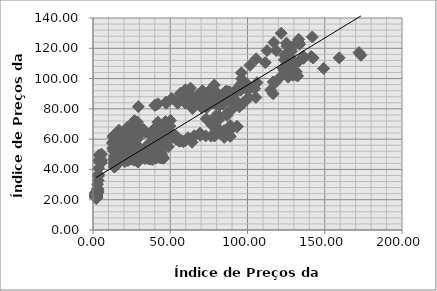
| Category | Series 0 |
|---|---|
| 2.13444915445322 | 22.032 |
| 2.13444915445322 | 21.808 |
| 2.13444915445322 | 21.896 |
| 2.13444915445322 | 22.04 |
| 2.13444915445322 | 22.049 |
| 2.13444915445322 | 21.743 |
| 2.13444915445322 | 21.682 |
| 2.13444915445322 | 21.726 |
| 2.13444915445322 | 21.878 |
| 2.13444915445322 | 21.218 |
| 2.13444915445322 | 20.765 |
| 2.13444915445322 | 21.111 |
| 2.08333169406974 | 21.223 |
| 2.08333169406974 | 21.654 |
| 2.08333169406974 | 22.199 |
| 2.08333169406974 | 22.438 |
| 2.08333169406974 | 22.354 |
| 2.08333169406974 | 21.982 |
| 2.08333169406974 | 21.842 |
| 2.08333169406974 | 21.619 |
| 2.08333169406974 | 21.386 |
| 2.08333169406974 | 21.354 |
| 2.08333169406974 | 21.582 |
| 2.08333169406974 | 21.59 |
| 2.04291400240146 | 21.317 |
| 2.04291400240146 | 21.414 |
| 2.04291400240146 | 21.411 |
| 2.04291400240146 | 21.447 |
| 2.04291400240146 | 21.657 |
| 2.04291400240146 | 21.552 |
| 2.04291400240146 | 21.477 |
| 2.04291400240146 | 21.346 |
| 2.04291400240146 | 21.489 |
| 2.04291400240146 | 21.241 |
| 2.04291400240146 | 21.728 |
| 2.04291400240146 | 21.696 |
| 2.01464105072438 | 22.077 |
| 2.01464105072438 | 22.329 |
| 2.01464105072438 | 22.384 |
| 2.01464105072438 | 22.726 |
| 2.01464105072438 | 23.479 |
| 2.01464105072438 | 23.402 |
| 2.01464105072438 | 23.203 |
| 2.01464105072438 | 22.584 |
| 2.01464105072438 | 22.697 |
| 2.01464105072438 | 23.724 |
| 2.01464105072438 | 23.737 |
| 2.01464105072438 | 23.585 |
| 1.94437457589987 | 23.984 |
| 1.94437457589987 | 23.485 |
| 1.94437457589987 | 23.28 |
| 1.94437457589987 | 23.356 |
| 1.94437457589987 | 23.185 |
| 1.94437457589987 | 22.778 |
| 1.94437457589987 | 22.65 |
| 1.94437457589987 | 22.456 |
| 1.94437457589987 | 22.637 |
| 1.94437457589987 | 22.729 |
| 1.94437457589987 | 22.687 |
| 1.94437457589987 | 22.77 |
| 1.93898601535253 | 22.439 |
| 1.93898601535253 | 22.927 |
| 1.93898601535253 | 22.739 |
| 1.93898601535253 | 22.802 |
| 1.93898601535253 | 22.587 |
| 1.93898601535253 | 22.499 |
| 1.93898601535253 | 22.385 |
| 1.93898601535253 | 22.025 |
| 1.93898601535253 | 22.272 |
| 1.93898601535253 | 22.294 |
| 1.93898601535253 | 22.288 |
| 1.93898601535253 | 22.455 |
| 1.88204058774968 | 23.1 |
| 1.88204058774968 | 23.022 |
| 1.88204058774968 | 23.096 |
| 1.88204058774968 | 23.299 |
| 1.88204058774968 | 23.221 |
| 1.88204058774968 | 23.403 |
| 1.88204058774968 | 23.864 |
| 1.88204058774968 | 24.165 |
| 1.88204058774968 | 23.508 |
| 1.88204058774968 | 23.168 |
| 1.88204058774968 | 23.048 |
| 1.88204058774968 | 23.137 |
| 1.86618435986511 | 23.052 |
| 1.86618435986511 | 23.047 |
| 1.86618435986511 | 23.138 |
| 1.86618435986511 | 23.212 |
| 1.86618435986511 | 23.298 |
| 1.86618435986511 | 23.636 |
| 1.86618435986511 | 23.407 |
| 1.86618435986511 | 23.119 |
| 1.86618435986511 | 23.338 |
| 1.86618435986511 | 23.377 |
| 1.86618435986511 | 23.385 |
| 1.86618435986511 | 22.95 |
| 1.85300340098579 | 22.778 |
| 1.85300340098579 | 22.99 |
| 1.85300340098579 | 22.984 |
| 1.85300340098579 | 22.711 |
| 1.85300340098579 | 22.727 |
| 1.85300340098579 | 22.211 |
| 1.85300340098579 | 22.089 |
| 1.85300340098579 | 21.636 |
| 1.85300340098579 | 21.879 |
| 1.85300340098579 | 21.889 |
| 1.85300340098579 | 22.22 |
| 1.85300340098579 | 22.478 |
| 1.81259494779253 | 22.493 |
| 1.81259494779253 | 22.552 |
| 1.81259494779253 | 22.976 |
| 1.81259494779253 | 22.959 |
| 1.81259494779253 | 23.167 |
| 1.81259494779253 | 23.429 |
| 1.81259494779253 | 23.234 |
| 1.81259494779253 | 23.181 |
| 1.81259494779253 | 23.064 |
| 1.81259494779253 | 23.549 |
| 1.81259494779253 | 23.6 |
| 1.81259494779253 | 23.814 |
| 2.11311453784639 | 24.26 |
| 2.11311453784639 | 24.303 |
| 2.11311453784639 | 24.362 |
| 2.11311453784639 | 24.549 |
| 2.11311453784639 | 24.791 |
| 2.11311453784639 | 24.849 |
| 2.11311453784639 | 24.768 |
| 2.11311453784639 | 24.547 |
| 2.11311453784639 | 24.459 |
| 2.11311453784639 | 24.842 |
| 2.11311453784639 | 25.051 |
| 2.11311453784639 | 24.968 |
| 2.6558711591823 | 24.883 |
| 2.6558711591823 | 24.642 |
| 2.6558711591823 | 24.601 |
| 2.6558711591823 | 24.59 |
| 2.6558711591823 | 24.523 |
| 2.6558711591823 | 24.468 |
| 2.76286762185703 | 24.831 |
| 2.76286762185703 | 25 |
| 2.76286762185703 | 24.552 |
| 2.76286762185703 | 24.522 |
| 2.76286762185703 | 24.358 |
| 2.76286762185703 | 24.557 |
| 2.87178674063629 | 24.956 |
| 2.87178674063629 | 24.946 |
| 2.87178674063629 | 25.557 |
| 2.87178674063629 | 25.545 |
| 2.87178674063629 | 25.48 |
| 2.87178674063629 | 25.219 |
| 2.97878320331102 | 25.184 |
| 2.97878320331102 | 25.582 |
| 2.97878320331102 | 26.306 |
| 2.97878320331102 | 26.713 |
| 2.97878320331102 | 27.461 |
| 2.97878320331102 | 30.239 |
| 3.39561059763125 | 32.755 |
| 3.39561059763125 | 35.547 |
| 3.39561059763125 | 36.329 |
| 3.68450104685302 | 36.58 |
| 3.68450104685302 | 40.753 |
| 3.68450104685302 | 45.999 |
| 4.05898866621457 | 49.506 |
| 4.05898866621457 | 49.319 |
| 4.05898866621457 | 44.957 |
| 5.55693914366076 | 44.472 |
| 5.55693914366076 | 46.079 |
| 5.55693914366076 | 50.09 |
| 15.9696412226623 | 53.311 |
| 15.9696412226623 | 56.849 |
| 15.9696412226623 | 55.345 |
| 13.4017244858324 | 53.181 |
| 13.4017244858324 | 52.717 |
| 13.4017244858324 | 52.126 |
| 12.7597473424204 | 54.121 |
| 12.7597473424204 | 57.876 |
| 12.7597473424204 | 57.191 |
| 13.0807359141263 | 61.247 |
| 13.0807359141263 | 62.155 |
| 13.0807359141263 | 58.175 |
| 13.8359826225372 | 52.93 |
| 13.8359826225372 | 48.895 |
| 13.8359826225372 | 46.725 |
| 13.8359826225372 | 46.445 |
| 13.8359826225372 | 43.163 |
| 13.8359826225372 | 41.665 |
| 13.8466825137002 | 43.831 |
| 13.8466825137002 | 47.396 |
| 13.8466825137002 | 45.569 |
| 13.8787811667912 | 44.249 |
| 13.8787811667912 | 41.889 |
| 13.8787811667912 | 41.617 |
| 15.188340268839 | 42.849 |
| 15.188340268839 | 43.742 |
| 15.188340268839 | 44.367 |
| 15.2014208085081 | 45.429 |
| 15.2014208085081 | 47.216 |
| 15.2406624275154 | 49.98 |
| 15.3369594071863 | 50.504 |
| 15.3631204865245 | 49.562 |
| 15.3631204865245 | 50.512 |
| 15.7102701375687 | 50.643 |
| 15.7233506772378 | 51.397 |
| 15.7364312169068 | 53.004 |
| 16.7203558965652 | 55.458 |
| 16.7726780552416 | 58.396 |
| 16.8250002139179 | 63.486 |
| 16.7976628578391 | 65.9 |
| 16.7975582783403 | 62.873 |
| 16.8629609766858 | 59.252 |
| 17.0686354756967 | 54.032 |
| 17.0555549360276 | 51.597 |
| 17.0686354756967 | 50.629 |
| 17.1352144507827 | 49.854 |
| 17.1221339111137 | 51.418 |
| 17.1352144507827 | 52.656 |
| 17.3957913798922 | 53.08 |
| 17.3708049819963 | 53.835 |
| 17.3838855216654 | 56.473 |
| 17.3922047643222 | 58.204 |
| 17.5255540418016 | 57.006 |
| 17.6303615914368 | 55.921 |
| 17.6470000767504 | 53.614 |
| 17.6945599180167 | 53.837 |
| 17.7183403488488 | 56.504 |
| 17.7718387842656 | 57.965 |
| 18.1594063310576 | 57.422 |
| 19.5896021689159 | 56.952 |
| 23.3625847801409 | 57.587 |
| 26.9327093612949 | 58.911 |
| 28.362316550584 | 59.849 |
| 28.8033835531907 | 60.655 |
| 40.7055637490136 | 61.249 |
| 41.9889324484616 | 65.692 |
| 40.7709664473591 | 66.589 |
| 41.4105083790621 | 65.372 |
| 43.015455319183 | 66.306 |
| 44.9924530343202 | 65.449 |
| 48.7504097676048 | 65.765 |
| 47.7066062201957 | 66.551 |
| 47.6207141312704 | 66.765 |
| 45.8136787328081 | 68.937 |
| 45.5985097347976 | 67.003 |
| 45.5466040359879 | 65.835 |
| 46.148474764079 | 68.379 |
| 46.1362943534064 | 67.657 |
| 44.4891656126257 | 68.008 |
| 42.0592128789039 | 69.07 |
| 42.0082845262526 | 71.216 |
| 46.876035133463 | 71.55 |
| 50.1152447427866 | 72.392 |
| 49.5006039350557 | 68.347 |
| 49.7855699502078 | 68.662 |
| 47.8317084337331 | 66.485 |
| 47.576120519577 | 65.866 |
| 46.8937684179572 | 64.555 |
| 44.6890542301091 | 62.875 |
| 43.0038591266638 | 61.337 |
| 43.9383152905537 | 61.228 |
| 44.4596273952911 | 59.676 |
| 44.5381126741012 | 58.372 |
| 45.2460821848255 | 57.621 |
| 46.4432661675943 | 57.418 |
| 46.1674557682507 | 56.444 |
| 45.7566879376098 | 57.069 |
| 42.8773173091676 | 56.584 |
| 40.6886608945154 | 55.458 |
| 42.2520135260949 | 55.188 |
| 43.897397568166 | 55.044 |
| 43.6013744568023 | 52.811 |
| 43.7880307743647 | 51.433 |
| 43.3315308826873 | 50.097 |
| 44.4942353597793 | 49.839 |
| 44.8853804665771 | 48.418 |
| 43.9129070779662 | 49.693 |
| 41.9570053226452 | 50.256 |
| 40.7796900005726 | 50.374 |
| 39.1319448563304 | 51.144 |
| 38.1784622344082 | 52.153 |
| 39.5824772425138 | 54.255 |
| 39.2258223669314 | 55.71 |
| 39.9534180499288 | 55.403 |
| 40.0085845160402 | 56.467 |
| 40.2867942939067 | 61.361 |
| 39.7803737989244 | 62.324 |
| 39.1775980934256 | 62.425 |
| 38.5928578249034 | 61.73 |
| 38.0984672571583 | 61.774 |
| 38.2520498346734 | 63.194 |
| 38.4755661703657 | 62.288 |
| 38.7763329371493 | 63.672 |
| 38.7798888419982 | 64.259 |
| 38.6978691094166 | 65.865 |
| 38.4160773308767 | 62.786 |
| 37.2521870079563 | 58.025 |
| 37.4614274570896 | 57.142 |
| 37.5660235888703 | 56.867 |
| 37.0441218151658 | 55.579 |
| 36.8474624987649 | 54.464 |
| 35.946997295207 | 52.865 |
| 35.7890772512316 | 52.648 |
| 36.9149401681043 | 52.407 |
| 37.0647064677693 | 52.984 |
| 37.0373693157701 | 53.202 |
| 35.6630240586508 | 51.471 |
| 35.4252701127512 | 50.23 |
| 35.3515390788466 | 48.799 |
| 35.976861183777 | 47.89 |
| 35.8757929978732 | 47.048 |
| 36.7020274884839 | 46.934 |
| 37.5270859064335 | 48.223 |
| 35.1755158729115 | 50.623 |
| 33.1492816835215 | 51.965 |
| 23.7430973763656 | 50.903 |
| 19.9758918755802 | 51.2 |
| 19.0949351675052 | 50.273 |
| 20.8555766840622 | 48.856 |
| 18.7144234444406 | 46.573 |
| 16.2594330796929 | 45.413 |
| 20.5892136865704 | 45.147 |
| 21.0124473331592 | 46.329 |
| 20.8043826845809 | 46.295 |
| 21.3916871566309 | 46.346 |
| 22.6276384949234 | 45.852 |
| 24.5540150305458 | 47.014 |
| 23.6671300456997 | 47.152 |
| 24.2021123590733 | 46.773 |
| 24.0985114093291 | 47.714 |
| 24.5811715640264 | 49.44 |
| 24.9199936958297 | 48.793 |
| 26.0019291421114 | 48.149 |
| 25.1067158217063 | 48.393 |
| 24.4445042430907 | 51.366 |
| 24.7607414270049 | 51.944 |
| 24.072622308436 | 53.777 |
| 23.0504332621738 | 54.619 |
| 23.0936902741912 | 55.638 |
| 22.2769122783346 | 53.77 |
| 21.046610670028 | 53.55 |
| 22.7038318553594 | 54.208 |
| 22.344776920989 | 55.335 |
| 21.5539043637512 | 60.762 |
| 20.6836760500233 | 60.455 |
| 20.8334902631543 | 57.201 |
| 19.2113774718112 | 57.792 |
| 18.4267846589958 | 57.495 |
| 18.9294469829412 | 57.415 |
| 21.3877828458189 | 58.229 |
| 23.0628568007825 | 57.643 |
| 22.828631072866 | 57.544 |
| 24.3419663218373 | 59.111 |
| 25.6425805450522 | 59.068 |
| 24.5465027524327 | 59.306 |
| 24.1886718041892 | 59.436 |
| 24.145854053733 | 58.199 |
| 23.2292318580997 | 55.977 |
| 24.001968117373 | 56.231 |
| 24.8960053651171 | 56.227 |
| 25.2349233238524 | 55.569 |
| 26.7317935555695 | 55.078 |
| 28.3980611993245 | 55.582 |
| 26.9546412854787 | 55.814 |
| 25.0167046633936 | 56.25 |
| 23.1549470474669 | 56.576 |
| 23.2821033918425 | 56.049 |
| 21.873316633292 | 54.896 |
| 23.8277661860973 | 54.864 |
| 33.641703541385 | 54.379 |
| 40.4871250072456 | 54.381 |
| 42.740074827118 | 54.35 |
| 39.6206644788307 | 53.674 |
| 34.3374201161007 | 53.788 |
| 30.3065376174588 | 54.131 |
| 25.1243357158499 | 54.645 |
| 24.9388159993549 | 55.232 |
| 25.4254133636465 | 54.623 |
| 25.7225312941972 | 53.523 |
| 24.5925430499656 | 53.894 |
| 25.6257513760269 | 53.386 |
| 26.1112982619648 | 54.266 |
| 27.2558971653723 | 54.728 |
| 28.821665557336 | 54.8 |
| 28.119891616342 | 54.366 |
| 25.0360509286809 | 54.287 |
| 23.7111962659303 | 54.973 |
| 23.82714884525 | 54.734 |
| 23.7874296059218 | 54.655 |
| 25.241199547127 | 53.894 |
| 26.331457921689 | 54.067 |
| 27.7251581024443 | 54.275 |
| 27.2945595738569 | 53.782 |
| 27.0021965137959 | 53.534 |
| 28.0477132301708 | 53.111 |
| 28.0240687353758 | 52.19 |
| 26.4001408705687 | 52.756 |
| 25.283169322879 | 52.843 |
| 24.2066504703442 | 53.72 |
| 24.7738616602222 | 54.18 |
| 25.7393488155619 | 54.859 |
| 25.8927272081564 | 56.033 |
| 25.3676844547915 | 57.751 |
| 24.3548394622919 | 56.689 |
| 23.232166062299 | 58.793 |
| 23.6636114119781 | 58.557 |
| 23.0362953404749 | 58.47 |
| 23.3625549064519 | 58.603 |
| 22.2650911154806 | 59.646 |
| 20.8181789339281 | 60.738 |
| 21.1344409673467 | 60.817 |
| 21.1927123039255 | 60.984 |
| 20.2868476017843 | 60.779 |
| 21.6279216415678 | 60.981 |
| 22.8435984093131 | 62.773 |
| 23.8690255732876 | 63.805 |
| 24.7244306914591 | 66.271 |
| 23.414660322888 | 66.539 |
| 22.3494802882125 | 67.937 |
| 22.7004725959936 | 65.737 |
| 23.4569687544519 | 65.673 |
| 22.5550208884126 | 66.105 |
| 23.4108734395781 | 66.19 |
| 24.0817017808479 | 66.994 |
| 23.9890354970022 | 67.039 |
| 25.4558032469316 | 66.609 |
| 25.327435291386 | 66.594 |
| 24.2736643179164 | 66.424 |
| 22.711844686712 | 67.545 |
| 23.2695043784011 | 66.56 |
| 23.7443141806998 | 66.192 |
| 23.1547425747667 | 67.319 |
| 24.1034322264552 | 67.785 |
| 26.1572998880292 | 67.19 |
| 26.3893024018199 | 67.307 |
| 28.2112338729412 | 68.599 |
| 28.0724172367715 | 68.546 |
| 28.7205982970644 | 71.338 |
| 26.8265374592828 | 72.295 |
| 26.5650704062991 | 70.648 |
| 27.6951979178567 | 69.618 |
| 28.0274863950669 | 69.019 |
| 29.7109600196629 | 67.311 |
| 31.9135575217735 | 65.188 |
| 31.4098572609319 | 64.904 |
| 33.750020562386 | 64.466 |
| 32.620649316756 | 66.505 |
| 28.1687561707154 | 68.021 |
| 26.5375950147528 | 69.952 |
| 25.1690754102254 | 69.492 |
| 27.0312080941491 | 69.725 |
| 25.3825404385373 | 67.495 |
| 25.7753711173321 | 65.002 |
| 26.6137448386636 | 64.129 |
| 27.0825103667788 | 63.578 |
| 28.7778496676315 | 62.385 |
| 27.584331156432 | 62.432 |
| 24.4309184113573 | 61.589 |
| 21.889461250263 | 60.188 |
| 21.1611942424215 | 61.342 |
| 20.046349246379 | 59.934 |
| 20.6108664457309 | 60.277 |
| 20.7365429423479 | 58.788 |
| 19.1015380962292 | 56.522 |
| 19.2747585375829 | 55.739 |
| 18.4318273318885 | 54.374 |
| 20.066263517609 | 54.656 |
| 19.251512535326 | 55.127 |
| 17.9941673598549 | 55.957 |
| 15.9318753678505 | 54.93 |
| 17.141791386768 | 55.162 |
| 16.2813998561439 | 52.696 |
| 18.8590170690153 | 51.309 |
| 22.1763945421409 | 50.57 |
| 22.5366253949268 | 50.31 |
| 22.9690070409963 | 49.941 |
| 25.8073289400256 | 48.338 |
| 27.8624190391228 | 49.296 |
| 30.2100059581692 | 50.17 |
| 29.7737702161102 | 50.062 |
| 31.6796886952575 | 49.999 |
| 32.7740271856654 | 49.864 |
| 33.4509886374177 | 50.275 |
| 35.8520950743094 | 50.373 |
| 36.3669275795101 | 50.005 |
| 32.4797934045581 | 50.361 |
| 37.1248565662123 | 50.041 |
| 40.6858249215626 | 49.142 |
| 38.9152200863746 | 47.948 |
| 40.6902203596792 | 47.71 |
| 44.6452489557366 | 47.5 |
| 44.0160986355991 | 47.561 |
| 45.752860883908 | 47.374 |
| 42.7645046407171 | 48.078 |
| 42.7081482780589 | 48.002 |
| 40.7203523135399 | 47.439 |
| 37.7526468632122 | 47.203 |
| 38.4958567741402 | 46.623 |
| 39.1444628913753 | 46.951 |
| 37.8605400801384 | 46.829 |
| 34.4544937140374 | 48.819 |
| 35.3492669089947 | 48.674 |
| 33.5993474158628 | 47.145 |
| 29.0493958812622 | 44.867 |
| 26.5577490551793 | 46.093 |
| 26.3077505703597 | 46.309 |
| 26.5994260634741 | 46.625 |
| 27.5690994027609 | 46.641 |
| 32.3784479776106 | 47.572 |
| 34.6899977243402 | 47.58 |
| 35.040213246353 | 48.25 |
| 33.3664426392669 | 50.02 |
| 34.3875607587734 | 51.667 |
| 35.5969821271491 | 52.437 |
| 37.9001880276628 | 54.219 |
| 38.0058484310903 | 54.332 |
| 34.7402608859164 | 53.595 |
| 39.2446402073549 | 54.663 |
| 43.3356311463738 | 54.95 |
| 48.7656773478262 | 54.933 |
| 43.6744064150957 | 54.261 |
| 37.7788122937304 | 53.788 |
| 39.036270692887 | 53.366 |
| 40.9765368819243 | 52.861 |
| 40.7002005614045 | 52.303 |
| 41.824480826727 | 53.124 |
| 38.4293394942719 | 54.471 |
| 40.7263875103202 | 57.443 |
| 40.8318140131138 | 58.929 |
| 44.0595056238516 | 58.828 |
| 45.639604541995 | 60.467 |
| 44.8679210168448 | 61.996 |
| 47.7156548553616 | 64.116 |
| 48.4192020408511 | 63.659 |
| 53.5104453538959 | 62.383 |
| 51.456799105587 | 61.127 |
| 53.7481562835058 | 59.827 |
| 57.4736793836876 | 59.004 |
| 56.489603219841 | 58.775 |
| 64.0911565501041 | 57.946 |
| 58.458689904499 | 58.28 |
| 55.8163748176321 | 58.618 |
| 59.7171359469343 | 59.03 |
| 61.5583492929362 | 61.002 |
| 69.252887291942 | 63.983 |
| 69.36600427769 | 62.485 |
| 65.4848451951234 | 62.283 |
| 72.9016153884566 | 62.15 |
| 76.4079344212574 | 61.951 |
| 84.9405517270983 | 61.147 |
| 88.8110977262589 | 61.815 |
| 86.1432983427819 | 62.673 |
| 78.6318655884727 | 62.046 |
| 83.2648340615469 | 63.434 |
| 84.7409483659603 | 65.568 |
| 80.5063231829501 | 67.552 |
| 81.1512498740684 | 66.402 |
| 89.2191110751075 | 66.556 |
| 88.8086883099414 | 68.973 |
| 88.3972079676406 | 67.688 |
| 93.0712010093556 | 68.359 |
| 93.3710721006924 | 68.322 |
| 80.0936400839682 | 67.632 |
| 76.9533059409694 | 69.237 |
| 79.2553813941476 | 71.566 |
| 81.3118367883702 | 72.676 |
| 73.205269262031 | 73.431 |
| 79.3940893008335 | 75.367 |
| 81.5502157450972 | 75.259 |
| 86.7892309275411 | 75.689 |
| 86.9235547594042 | 77.25 |
| 90.0429313949326 | 79.797 |
| 94.7492363107327 | 81.364 |
| 91.2335640219077 | 81.742 |
| 98.2920914821961 | 85.155 |
| 105.429548808738 | 87.544 |
| 116.563056582795 | 89.986 |
| 114.947610609315 | 92.449 |
| 118.022002649021 | 97.501 |
| 123.631665149789 | 105.537 |
| 133.28401081923 | 111.541 |
| 142.485180235351 | 113.577 |
| 159.359449196135 | 113.668 |
| 172.1705281131 | 117.13 |
| 173.432352861786 | 115.389 |
| 149.292221137717 | 106.672 |
| 132.407785287554 | 101.67 |
| 100.921950995436 | 87.372 |
| 80.0160020277149 | 82.745 |
| 64.4553994915214 | 80.254 |
| 65.556613520885 | 85.236 |
| 60.6509484638096 | 84.522 |
| 64.2201759520826 | 83.723 |
| 66.3153273673952 | 86.569 |
| 74.9318209424136 | 91.54 |
| 86.9182238451886 | 91.48 |
| 81.0653006266983 | 88.109 |
| 88.2807006743008 | 91.276 |
| 84.4506931251408 | 90.171 |
| 92.4267539119982 | 91.806 |
| 96.1799245822894 | 94.374 |
| 95.8636928462649 | 95.285 |
| 99.915066532979 | 96.231 |
| 96.6799059567536 | 93.721 |
| 100.235124639211 | 92.123 |
| 104.677934923191 | 93.39 |
| 95.6114775515865 | 92.561 |
| 95.5740992909282 | 92.446 |
| 95.3093396712495 | 95.728 |
| 96.139493842211 | 99.794 |
| 96.059284733158 | 103.788 |
| 101.56892825729 | 108.718 |
| 105.556835288782 | 113.038 |
| 112.67250931266 | 118.462 |
| 117.044624474564 | 123.85 |
| 121.805953191553 | 129.922 |
| 133.087461133985 | 125.906 |
| 141.943505357582 | 127.459 |
| 133.139427785911 | 123.87 |
| 131.1664017686 | 122.995 |
| 133.733647022599 | 122.653 |
| 125.216487414072 | 123.437 |
| 125.512446419423 | 121.377 |
| 124.169987536309 | 115.339 |
| 129.396896522898 | 112.019 |
| 128.019046528116 | 109.426 |
| 130.634742586956 | 111.134 |
| 136.238200126631 | 113.371 |
| 141.238440830888 | 114.541 |
| 136.117180731224 | 114.746 |
| 126.276524708769 | 112.898 |
| 111.529875902901 | 110.53 |
| 118.550143076463 | 118.441 |
| 127.653999665049 | 118.071 |
| 128.526647988297 | 118.113 |
| 125.880541024351 | 114.939 |
| 124.075638862126 | 112.557 |
| 124.174980468256 | 112.129 |
| 128.410627561476 | 111.19 |
| 131.220172543944 | 110.021 |
| 126.222482032848 | 109.007 |
| 123.12660667859 | 106.736 |
| 123.208654744218 | 107.082 |
| 122.935667617675 | 107.098 |
| 128.11705322178 | 104.711 |
| 130.925996497883 | 102.609 |
| 131.601285972423 | 102.604 |
| 128.285159706738 | 102.862 |
| 125.381102595313 | 102.057 |
| 129.482298329975 | 102.201 |
| 126.3809724991 | 100.965 |
| 130.574174333607 | 103.206 |
| 127.930918913206 | 108.071 |
| 128.411964813423 | 107.312 |
| 128.959710737114 | 106.878 |
| 131.476513457335 | 104.656 |
| 126.926352514665 | 102.608 |
| 121.203952616882 | 100.94 |
| 116.620966023104 | 97.809 |
| 106.197347017781 | 97.306 |
| 96.382501237331 | 97.15 |
| 78.5529041670128 | 95.712 |
| 63.1025415179041 | 93.671 |
| 70.8695035913829 | 91.99 |
| 68.4203375211783 | 89.801 |
| 71.8576506888508 | 89.454 |
| 77.5763908269966 | 89.278 |
| 76.0774722410244 | 89.084 |
| 68.7834662650117 | 89.422 |
| 59.2499152363422 | 85.608 |
| 59.6596724023675 | 83.856 |
| 59.647837375447 | 84.764 |
| 54.8278313237964 | 83.703 |
| 47.374929642217 | 83.658 |
| 40.0109367674408 | 82.299 |
| 40.7838493304395 | 82.531 |
| 47.2023951625992 | 84.412 |
| 51.0091130592508 | 86.889 |
| 56.7537865339248 | 89.632 |
| 59.7699885822056 | 92.584 |
| 56.6296869501217 | 90.364 |
| 57.432671901961 | 89.144 |
| 58.2289698034227 | 88.625 |
| 64.3243622044479 | 87.424 |
| 60.0348969229017 | 87.911 |
| 68.4664641732331 | 87.698 |
| 69.2784503032811 | 89.513 |
| 69.3218175527156 | 88.998 |
| 65.1946734536431 | 87.736 |
| 66.9865116348308 | 86.873 |
| 64.22733905791 | 88.198 |
| 60.2076549980431 | 87.158 |
| 62.1908781612678 | 87.539 |
| 65.2935422670345 | 85.61 |
| 68.8171757502039 | 86.142 |
| 70.8499046496286 | 85.326 |
| 76.6322052942354 | 85.601 |
| 78.106568426918 | 84.811 |
| 85.039025029591 | 87.037 |
| 80.5389328378601 | 88.676 |
| 80.8934291793948 | 90.038 |
| 85.911920968843 | 91.659 |
| 91.746851044716 | 91.84 |
| 90.8140552367639 | 88.938 |
| 91.6905704366986 | 86.35 |
| 90.3832314765585 | 84.834 |
| 95.6302110317991 | 82.644 |
| 96.865705469011 | 83.382 |
| 81.912159856784 | 82.228 |
| 72.6380660553318 | 82.631 |
| 73.8038401983675 | 83.502 |
| 77.3922623886037 | 83.756 |
| 79.9471001542472 | 83.003 |
| 84.1889147168357 | 83.082 |
| 81.7841718371864 | 82.243 |
| 73.0575136620423 | 84.498 |
| 74.8500557489246 | 83.299 |
| 70.3746374042227 | 80.775 |
| 73.6126872713526 | 80.766 |
| 70.9048208930796 | 82.279 |
| 74.6189365444729 | 85.282 |
| 76.9336157182885 | 87.296 |
| 74.4547457721121 | 88.321 |
| 64.9793128629587 | 86.04 |
| 42.0798283296475 | 83.356 |
| 29.3763206469342 | 81.464 |